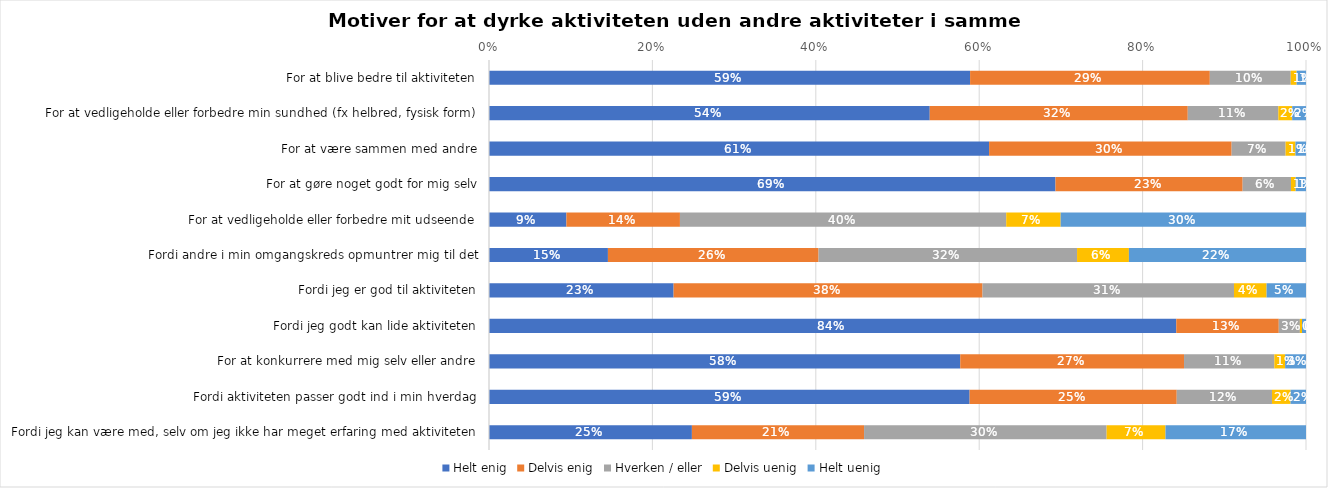
| Category | Helt enig | Delvis enig | Hverken / eller | Delvis uenig | Helt uenig |
|---|---|---|---|---|---|
| For at blive bedre til aktiviteten | 0.589 | 0.293 | 0.099 | 0.007 | 0.011 |
| For at vedligeholde eller forbedre min sundhed (fx helbred, fysisk form) | 0.539 | 0.316 | 0.111 | 0.017 | 0.017 |
| For at være sammen med andre | 0.612 | 0.297 | 0.066 | 0.012 | 0.013 |
| For at gøre noget godt for mig selv | 0.693 | 0.229 | 0.059 | 0.006 | 0.013 |
| For at vedligeholde eller forbedre mit udseende | 0.095 | 0.139 | 0.399 | 0.067 | 0.3 |
| Fordi andre i min omgangskreds opmuntrer mig til det | 0.146 | 0.258 | 0.316 | 0.063 | 0.217 |
| Fordi jeg er god til aktiviteten | 0.226 | 0.378 | 0.308 | 0.04 | 0.048 |
| Fordi jeg godt kan lide aktiviteten | 0.841 | 0.125 | 0.026 | 0.003 | 0.005 |
| For at konkurrere med mig selv eller andre | 0.577 | 0.274 | 0.111 | 0.013 | 0.026 |
| Fordi aktiviteten passer godt ind i min hverdag | 0.588 | 0.254 | 0.117 | 0.023 | 0.019 |
| Fordi jeg kan være med, selv om jeg ikke har meget erfaring med aktiviteten | 0.248 | 0.211 | 0.297 | 0.072 | 0.172 |